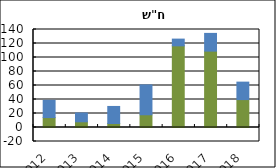
| Category | הבלאי | גידול המחזור |
|---|---|---|
| 2012.0 | 14.149 | 24.679 |
| 2013.0 | 8.167 | 12.531 |
| 2014.0 | 5.746 | 24.325 |
| 2015.0 | 18.186 | 42.629 |
| 2016.0 | 116.623 | 9.656 |
| 2017.0 | 109.101 | 25.325 |
| 2018.0 | 39.859 | 24.96 |